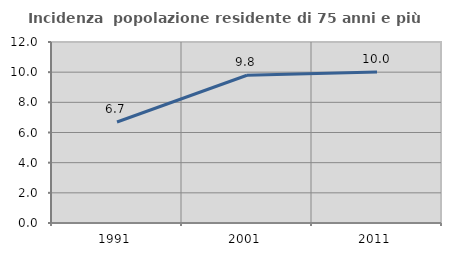
| Category | Incidenza  popolazione residente di 75 anni e più |
|---|---|
| 1991.0 | 6.695 |
| 2001.0 | 9.797 |
| 2011.0 | 10.005 |